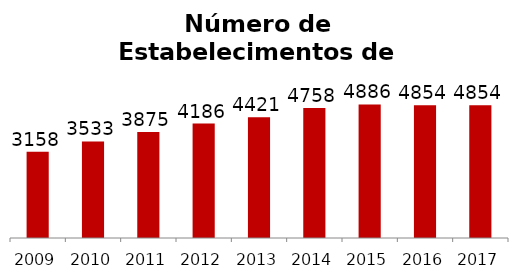
| Category | Alimentação |
|---|---|
| 2009.0 | 3158 |
| 2010.0 | 3533 |
| 2011.0 | 3875 |
| 2012.0 | 4186 |
| 2013.0 | 4421 |
| 2014.0 | 4758 |
| 2015.0 | 4886 |
| 2016.0 | 4854 |
| 2017.0 | 4854 |